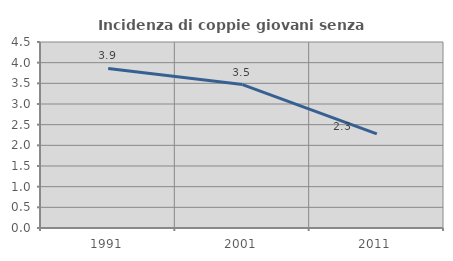
| Category | Incidenza di coppie giovani senza figli |
|---|---|
| 1991.0 | 3.861 |
| 2001.0 | 3.47 |
| 2011.0 | 2.276 |